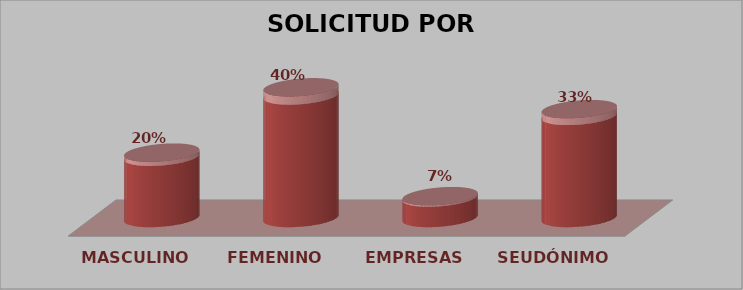
| Category | SOLICITUD POR GÉNERO | Series 1 |
|---|---|---|
| MASCULINO | 3 | 0.2 |
| FEMENINO | 6 | 0.4 |
| EMPRESAS | 1 | 0.07 |
| SEUDÓNIMO | 5 | 0.33 |